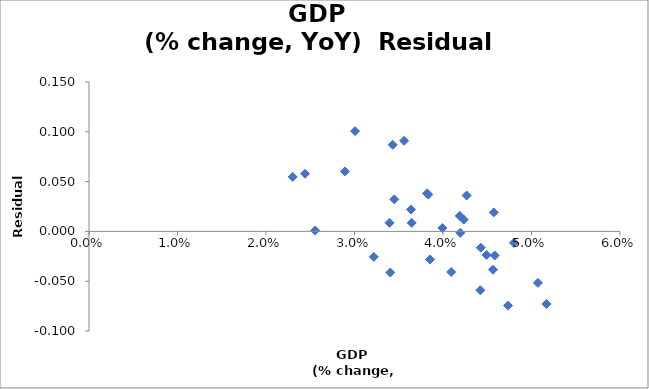
| Category | Series 0 |
|---|---|
| 0.039936180144779065 | 0.003 |
| 0.0457410733479886 | 0.019 |
| 0.04189226141646163 | 0.016 |
| 0.03833874495632217 | 0.037 |
| 0.03819483991129635 | 0.038 |
| 0.03395247979098004 | 0.009 |
| 0.036461340612041315 | 0.009 |
| 0.048018422326603805 | -0.012 |
| 0.04233941224300142 | 0.012 |
| 0.04266959126212977 | 0.036 |
| 0.03560282341024901 | 0.091 |
| 0.03432002896415676 | 0.087 |
| 0.030063829918959062 | 0.101 |
| 0.03638387914277974 | 0.022 |
| 0.04426948022177535 | -0.016 |
| 0.032185448049440124 | -0.026 |
| 0.04735573600033649 | -0.075 |
| 0.05170131820259116 | -0.073 |
| 0.04421914055411502 | -0.059 |
| 0.050722392108940584 | -0.052 |
| 0.04565070183291442 | -0.038 |
| 0.03449813203309282 | 0.032 |
| 0.02892059309919559 | 0.06 |
| 0.02441236700351679 | 0.058 |
| 0.023017018544231327 | 0.055 |
| 0.02555765884207717 | 0.001 |
| 0.03404088392973881 | -0.041 |
| 0.04093084398476843 | -0.041 |
| 0.038539325239931754 | -0.028 |
| 0.04194238175280329 | -0.001 |
| 0.044922862923621576 | -0.024 |
| 0.04583929111915919 | -0.024 |